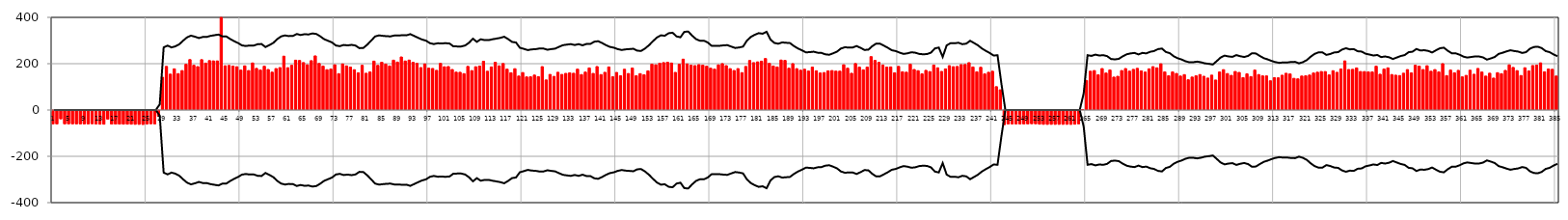
| Category | Коммерч |
|---|---|
| 0 | -61.424 |
| 1 | -61.596 |
| 2 | -39.695 |
| 3 | -61.449 |
| 4 | -61.481 |
| 5 | -61.507 |
| 6 | -61.566 |
| 7 | -61.611 |
| 8 | -61.558 |
| 9 | -61.572 |
| 10 | -60.806 |
| 11 | -62.215 |
| 12 | -62.842 |
| 13 | -62.888 |
| 14 | -40.828 |
| 15 | -62.418 |
| 16 | -62.504 |
| 17 | -62.665 |
| 18 | -62.781 |
| 19 | -62.767 |
| 20 | -62.87 |
| 21 | -63.203 |
| 22 | -63.323 |
| 23 | -63.776 |
| 24 | -62.591 |
| 25 | -60.986 |
| 26 | -61.434 |
| 27 | -28.352 |
| 28 | 141.677 |
| 29 | 188.447 |
| 30 | 154.985 |
| 31 | 177.776 |
| 32 | 157.188 |
| 33 | 170.319 |
| 34 | 197.323 |
| 35 | 217.698 |
| 36 | 193.243 |
| 37 | 187.428 |
| 38 | 217.415 |
| 39 | 202.36 |
| 40 | 213.285 |
| 41 | 212.043 |
| 42 | 211.878 |
| 43 | 1385.104 |
| 44 | 191.111 |
| 45 | 192.517 |
| 46 | 189.653 |
| 47 | 186.964 |
| 48 | 172.306 |
| 49 | 190.737 |
| 50 | 170.46 |
| 51 | 203.112 |
| 52 | 179.75 |
| 53 | 172.697 |
| 54 | 189.149 |
| 55 | 174.996 |
| 56 | 163.429 |
| 57 | 179.028 |
| 58 | 183.183 |
| 59 | 232.433 |
| 60 | 182.782 |
| 61 | 192.982 |
| 62 | 215.137 |
| 63 | 213.985 |
| 64 | 204.754 |
| 65 | 195.366 |
| 66 | 213.074 |
| 67 | 233.614 |
| 68 | 200.934 |
| 69 | 189.702 |
| 70 | 174.047 |
| 71 | 176.713 |
| 72 | 195.329 |
| 73 | 156.99 |
| 74 | 198.932 |
| 75 | 190.596 |
| 76 | 185.387 |
| 77 | 174.056 |
| 78 | 160.627 |
| 79 | 192.993 |
| 80 | 158.763 |
| 81 | 164.351 |
| 82 | 211.035 |
| 83 | 192.778 |
| 84 | 206.24 |
| 85 | 198.238 |
| 86 | 190.217 |
| 87 | 215.162 |
| 88 | 206.927 |
| 89 | 228.994 |
| 90 | 211.464 |
| 91 | 215.6 |
| 92 | 206.038 |
| 93 | 201.25 |
| 94 | 183.387 |
| 95 | 198.966 |
| 96 | 180.696 |
| 97 | 179.414 |
| 98 | 171.277 |
| 99 | 201.308 |
| 100 | 186.847 |
| 101 | 187.719 |
| 102 | 174.975 |
| 103 | 163.413 |
| 104 | 162.907 |
| 105 | 157.026 |
| 106 | 188.366 |
| 107 | 170.287 |
| 108 | 186.93 |
| 109 | 189.9 |
| 110 | 210.485 |
| 111 | 167.399 |
| 112 | 186.013 |
| 113 | 206.11 |
| 114 | 190.919 |
| 115 | 200.755 |
| 116 | 176.338 |
| 117 | 160.858 |
| 118 | 178.332 |
| 119 | 146.734 |
| 120 | 161.76 |
| 121 | 142.98 |
| 122 | 143.569 |
| 123 | 150.868 |
| 124 | 144.077 |
| 125 | 187.402 |
| 126 | 129.938 |
| 127 | 153.682 |
| 128 | 145.239 |
| 129 | 162.984 |
| 130 | 153.772 |
| 131 | 158.209 |
| 132 | 160.48 |
| 133 | 158.749 |
| 134 | 176.424 |
| 135 | 153.111 |
| 136 | 163.758 |
| 137 | 181.627 |
| 138 | 157.965 |
| 139 | 187.684 |
| 140 | 153 |
| 141 | 162.78 |
| 142 | 185.976 |
| 143 | 143.782 |
| 144 | 162.334 |
| 145 | 147.921 |
| 146 | 176.038 |
| 147 | 157.651 |
| 148 | 181.266 |
| 149 | 148.104 |
| 150 | 157.063 |
| 151 | 152.186 |
| 152 | 169 |
| 153 | 197.954 |
| 154 | 195.06 |
| 155 | 201.9 |
| 156 | 204.642 |
| 157 | 206.317 |
| 158 | 202.869 |
| 159 | 162.55 |
| 160 | 197.494 |
| 161 | 219.561 |
| 162 | 198.964 |
| 163 | 193.546 |
| 164 | 191.776 |
| 165 | 195.924 |
| 166 | 193.437 |
| 167 | 189.054 |
| 168 | 180.449 |
| 169 | 176.369 |
| 170 | 194.861 |
| 171 | 200.206 |
| 172 | 191.477 |
| 173 | 178.609 |
| 174 | 170.634 |
| 175 | 178.903 |
| 176 | 161.415 |
| 177 | 188.083 |
| 178 | 213.809 |
| 179 | 204.525 |
| 180 | 207.909 |
| 181 | 210.867 |
| 182 | 222.246 |
| 183 | 201.423 |
| 184 | 189.896 |
| 185 | 185.833 |
| 186 | 215.651 |
| 187 | 214.144 |
| 188 | 180.453 |
| 189 | 200.148 |
| 190 | 178.675 |
| 191 | 171.868 |
| 192 | 176.005 |
| 193 | 168.17 |
| 194 | 185.235 |
| 195 | 169.486 |
| 196 | 159.845 |
| 197 | 161.752 |
| 198 | 169.189 |
| 199 | 170.493 |
| 200 | 167.891 |
| 201 | 167.8 |
| 202 | 195.34 |
| 203 | 180.594 |
| 204 | 158.654 |
| 205 | 200.571 |
| 206 | 185.424 |
| 207 | 173.458 |
| 208 | 185.444 |
| 209 | 230.48 |
| 210 | 214.072 |
| 211 | 205.8 |
| 212 | 194.303 |
| 213 | 185.257 |
| 214 | 186.178 |
| 215 | 160.742 |
| 216 | 188.452 |
| 217 | 165.162 |
| 218 | 163.347 |
| 219 | 197.731 |
| 220 | 174.947 |
| 221 | 169.777 |
| 222 | 156.109 |
| 223 | 171.195 |
| 224 | 165.993 |
| 225 | 194.056 |
| 226 | 182.287 |
| 227 | 166.728 |
| 228 | 177.567 |
| 229 | 191.715 |
| 230 | 187.257 |
| 231 | 188.095 |
| 232 | 196.009 |
| 233 | 196.555 |
| 234 | 204.41 |
| 235 | 185.808 |
| 236 | 164.874 |
| 237 | 184.575 |
| 238 | 155.931 |
| 239 | 162.844 |
| 240 | 167.371 |
| 241 | 100.749 |
| 242 | 87.201 |
| 243 | -64.793 |
| 244 | -61.876 |
| 245 | -61.937 |
| 246 | -61.965 |
| 247 | -62.007 |
| 248 | -61.83 |
| 249 | -61.488 |
| 250 | -60.71 |
| 251 | -61.076 |
| 252 | -62.853 |
| 253 | -63.239 |
| 254 | -63.45 |
| 255 | -63.263 |
| 256 | -63.313 |
| 257 | -63.298 |
| 258 | -63.275 |
| 259 | -63.238 |
| 260 | -63.483 |
| 261 | -62.879 |
| 262 | -61.276 |
| 263 | 1.413 |
| 264 | 127.632 |
| 265 | 167.475 |
| 266 | 170.408 |
| 267 | 152.185 |
| 268 | 179.079 |
| 269 | 159.601 |
| 270 | 172.908 |
| 271 | 142.185 |
| 272 | 145.565 |
| 273 | 170.417 |
| 274 | 179.05 |
| 275 | 167.818 |
| 276 | 175.496 |
| 277 | 179.994 |
| 278 | 168.895 |
| 279 | 163.838 |
| 280 | 177.844 |
| 281 | 187.405 |
| 282 | 182.185 |
| 283 | 199.607 |
| 284 | 164.492 |
| 285 | 148.164 |
| 286 | 164.351 |
| 287 | 157.908 |
| 288 | 146.618 |
| 289 | 152.783 |
| 290 | 130.636 |
| 291 | 142.323 |
| 292 | 147.643 |
| 293 | 153.141 |
| 294 | 145.838 |
| 295 | 137.998 |
| 296 | 150.596 |
| 297 | 129.553 |
| 298 | 164.215 |
| 299 | 174.331 |
| 300 | 157.491 |
| 301 | 149.705 |
| 302 | 166.389 |
| 303 | 162.301 |
| 304 | 139.943 |
| 305 | 156.043 |
| 306 | 144.333 |
| 307 | 172.398 |
| 308 | 153.17 |
| 309 | 147.45 |
| 310 | 147.218 |
| 311 | 126.243 |
| 312 | 139.544 |
| 313 | 139.103 |
| 314 | 150.289 |
| 315 | 158.658 |
| 316 | 155.775 |
| 317 | 136.736 |
| 318 | 134.611 |
| 319 | 146.637 |
| 320 | 147.637 |
| 321 | 150.967 |
| 322 | 159.759 |
| 323 | 163.257 |
| 324 | 166.137 |
| 325 | 165.942 |
| 326 | 151.557 |
| 327 | 169.722 |
| 328 | 162.772 |
| 329 | 177.226 |
| 330 | 212.106 |
| 331 | 175 |
| 332 | 175.654 |
| 333 | 181.738 |
| 334 | 166.227 |
| 335 | 165.973 |
| 336 | 164.529 |
| 337 | 164.463 |
| 338 | 189.239 |
| 339 | 154.479 |
| 340 | 176.801 |
| 341 | 182.056 |
| 342 | 153.25 |
| 343 | 150.396 |
| 344 | 148.805 |
| 345 | 158.957 |
| 346 | 174.628 |
| 347 | 160.272 |
| 348 | 193.111 |
| 349 | 189.497 |
| 350 | 174.883 |
| 351 | 191.208 |
| 352 | 167.4 |
| 353 | 174.55 |
| 354 | 164.395 |
| 355 | 200.057 |
| 356 | 148.602 |
| 357 | 172.431 |
| 358 | 160.623 |
| 359 | 171.195 |
| 360 | 143.145 |
| 361 | 149.517 |
| 362 | 171.806 |
| 363 | 154.469 |
| 364 | 179.473 |
| 365 | 163.99 |
| 366 | 146.43 |
| 367 | 158.934 |
| 368 | 137.95 |
| 369 | 161.14 |
| 370 | 156.848 |
| 371 | 170.996 |
| 372 | 194.885 |
| 373 | 183.795 |
| 374 | 170.11 |
| 375 | 148.914 |
| 376 | 182.519 |
| 377 | 168.831 |
| 378 | 192.022 |
| 379 | 193.794 |
| 380 | 203.649 |
| 381 | 165.106 |
| 382 | 177.028 |
| 383 | 175.874 |
| 384 | 146.769 |